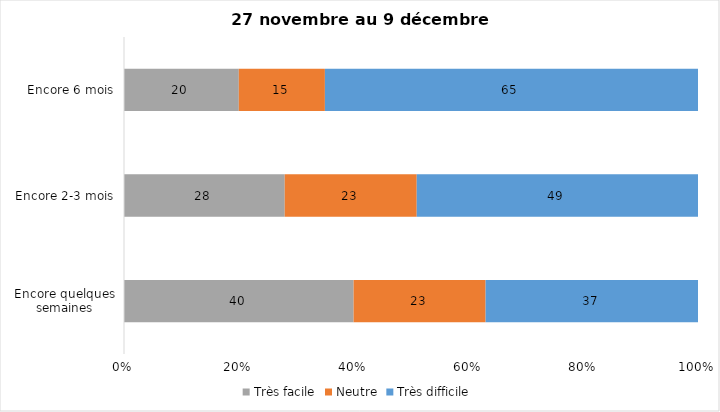
| Category | Très facile | Neutre | Très difficile |
|---|---|---|---|
| Encore quelques semaines | 40 | 23 | 37 |
| Encore 2-3 mois | 28 | 23 | 49 |
| Encore 6 mois | 20 | 15 | 65 |